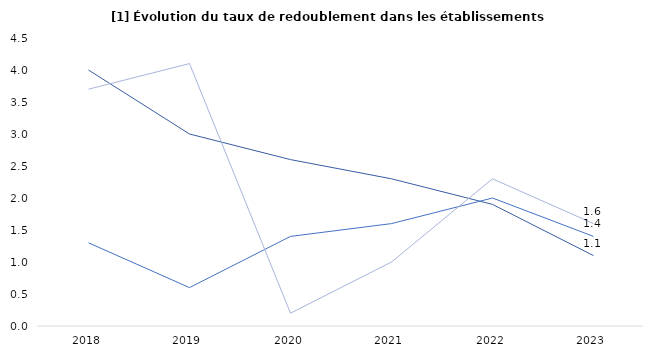
| Category | Seconde | Première | Terminale |
|---|---|---|---|
| 2018 | 4 | 1.3 | 3.7 |
| 2019 | 3 | 0.6 | 4.1 |
| 2020 | 2.6 | 1.4 | 0.2 |
| 2021 | 2.3 | 1.6 | 1 |
| 2022 | 1.9 | 2 | 2.3 |
| 2023 | 1.1 | 1.4 | 1.6 |